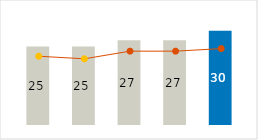
| Category | Fixed Cost |
|---|---|
| 0 | 25 |
| 1 | 25 |
| 2 | 27 |
| 3 | 27 |
| 4 | 30 |